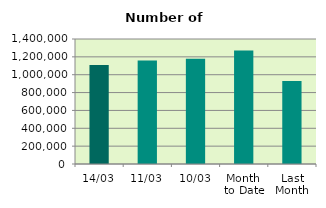
| Category | Series 0 |
|---|---|
| 14/03 | 1109348 |
| 11/03 | 1157934 |
| 10/03 | 1178066 |
| Month 
to Date | 1270601.4 |
| Last
Month | 928647.7 |